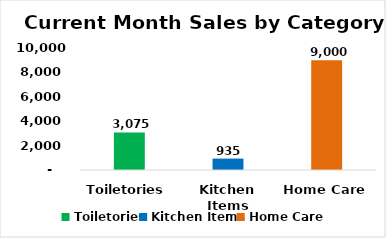
| Category | Total Sales |
|---|---|
| Toiletories | 3075 |
| Kitchen Items | 935 |
| Home Care | 9000 |